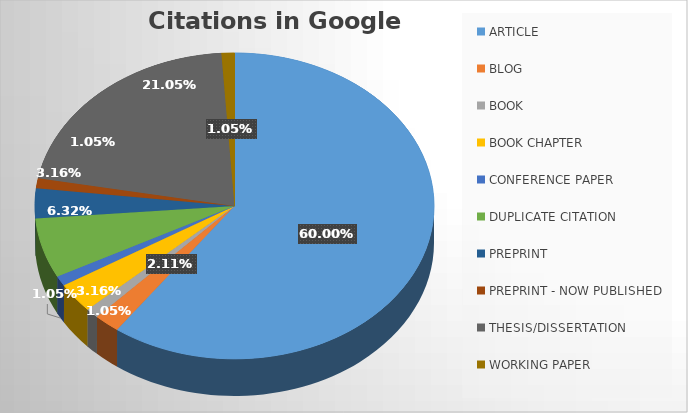
| Category | Total |
|---|---|
| ARTICLE | 57 |
| BLOG | 2 |
| BOOK | 1 |
| BOOK CHAPTER | 3 |
| CONFERENCE PAPER | 1 |
| DUPLICATE CITATION | 6 |
| PREPRINT | 3 |
| PREPRINT - NOW PUBLISHED | 1 |
| THESIS/DISSERTATION | 20 |
| WORKING PAPER | 1 |